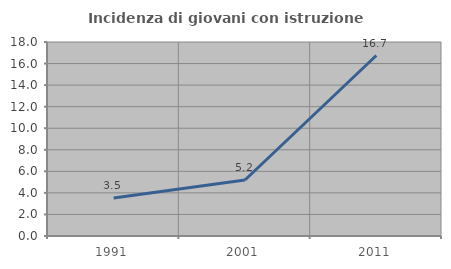
| Category | Incidenza di giovani con istruzione universitaria |
|---|---|
| 1991.0 | 3.524 |
| 2001.0 | 5.195 |
| 2011.0 | 16.746 |